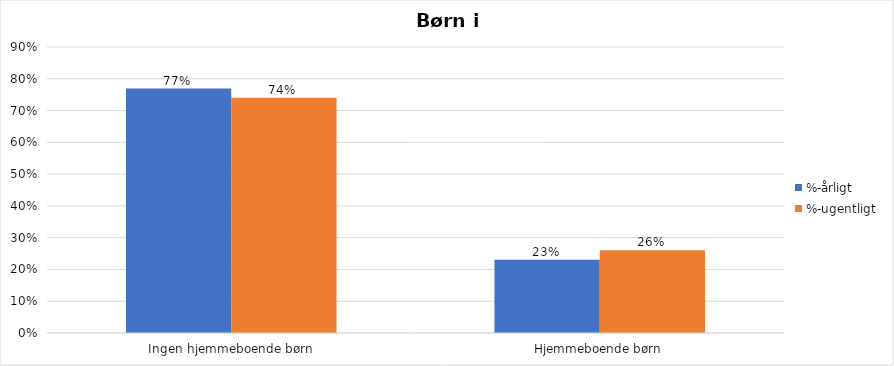
| Category | %-årligt | %-ugentligt |
|---|---|---|
| Ingen hjemmeboende børn | 0.769 | 0.74 |
| Hjemmeboende børn | 0.231 | 0.26 |